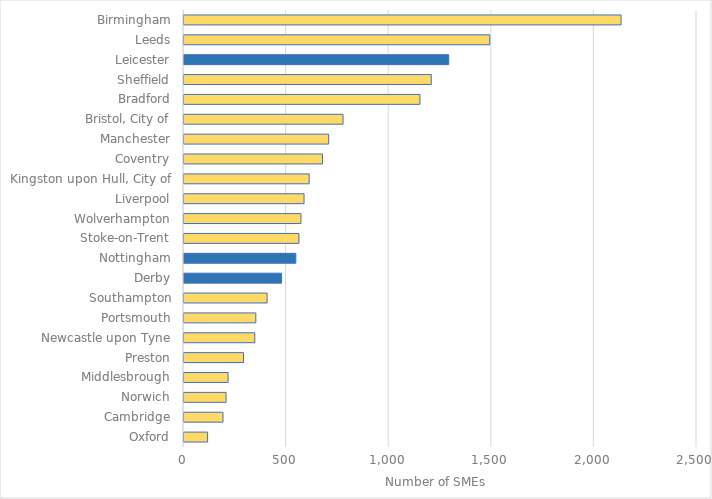
| Category | Series 0 |
|---|---|
| Oxford | 115 |
| Cambridge | 190 |
| Norwich | 205 |
| Middlesbrough | 215 |
| Preston | 290 |
| Newcastle upon Tyne | 345 |
| Portsmouth | 350 |
| Southampton | 405 |
| Derby | 475 |
| Nottingham | 545 |
| Stoke-on-Trent | 560 |
| Wolverhampton | 570 |
| Liverpool | 585 |
| Kingston upon Hull, City of | 610 |
| Coventry | 675 |
| Manchester | 705 |
| Bristol, City of | 775 |
| Bradford | 1150 |
| Sheffield | 1205 |
| Leicester | 1290 |
| Leeds | 1490 |
| Birmingham | 2130 |